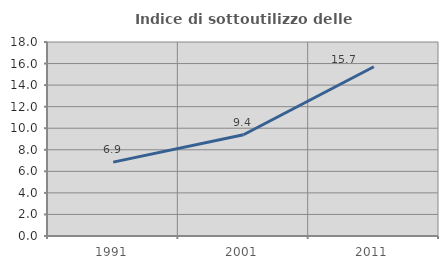
| Category | Indice di sottoutilizzo delle abitazioni  |
|---|---|
| 1991.0 | 6.852 |
| 2001.0 | 9.395 |
| 2011.0 | 15.701 |